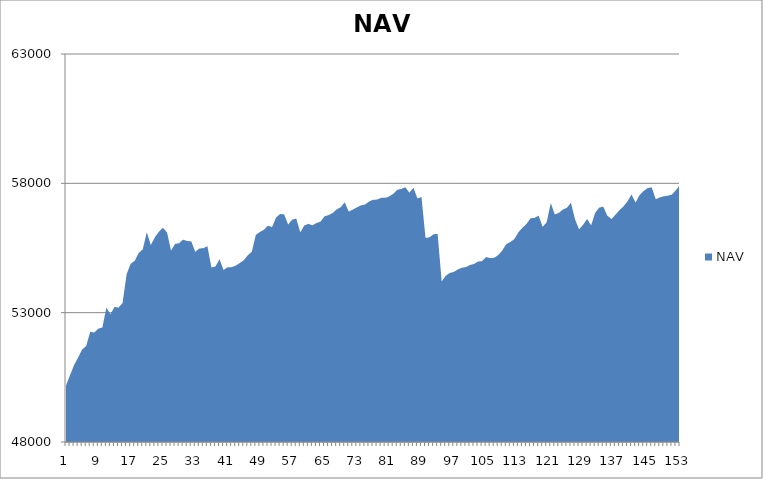
| Category | NAV |
|---|---|
| 0 | 50185.185 |
| 1 | 50585.185 |
| 2 | 50973.977 |
| 3 | 51265.977 |
| 4 | 51576.741 |
| 5 | 51711.523 |
| 6 | 52262.893 |
| 7 | 52230.24 |
| 8 | 52381.556 |
| 9 | 52425.915 |
| 10 | 53192.581 |
| 11 | 52939.146 |
| 12 | 53220.069 |
| 13 | 53197.341 |
| 14 | 53369.61 |
| 15 | 54480.721 |
| 16 | 54888.365 |
| 17 | 55001.902 |
| 18 | 55308.308 |
| 19 | 55448.308 |
| 20 | 56110.305 |
| 21 | 55610.305 |
| 22 | 55916.954 |
| 23 | 56129.798 |
| 24 | 56279.798 |
| 25 | 56105.301 |
| 26 | 55401.645 |
| 27 | 55657.201 |
| 28 | 55686.925 |
| 29 | 55823.001 |
| 30 | 55769.596 |
| 31 | 55759.375 |
| 32 | 55350.284 |
| 33 | 55480.284 |
| 34 | 55492.498 |
| 35 | 55570.42 |
| 36 | 54746.89 |
| 37 | 54783.7 |
| 38 | 55066.459 |
| 39 | 54651.074 |
| 40 | 54754.078 |
| 41 | 54760.213 |
| 42 | 54816.924 |
| 43 | 54917.296 |
| 44 | 55025.73 |
| 45 | 55220.535 |
| 46 | 55353.465 |
| 47 | 56009.309 |
| 48 | 56118.959 |
| 49 | 56205.212 |
| 50 | 56362.876 |
| 51 | 56307.394 |
| 52 | 56678.935 |
| 53 | 56813.264 |
| 54 | 56799.502 |
| 55 | 56409.112 |
| 56 | 56596.44 |
| 57 | 56640.493 |
| 58 | 56102.227 |
| 59 | 56370.449 |
| 60 | 56434.248 |
| 61 | 56376.841 |
| 62 | 56464.524 |
| 63 | 56518.022 |
| 64 | 56724.747 |
| 65 | 56770.361 |
| 66 | 56848.099 |
| 67 | 56992.896 |
| 68 | 57073.571 |
| 69 | 57266.481 |
| 70 | 56908.016 |
| 71 | 56984.939 |
| 72 | 57069.276 |
| 73 | 57147.627 |
| 74 | 57179.83 |
| 75 | 57291.17 |
| 76 | 57366.35 |
| 77 | 57371.599 |
| 78 | 57439.215 |
| 79 | 57440.895 |
| 80 | 57490.895 |
| 81 | 57593.679 |
| 82 | 57746.643 |
| 83 | 57785.413 |
| 84 | 57849.748 |
| 85 | 57639.346 |
| 86 | 57828.82 |
| 87 | 57417.055 |
| 88 | 57471.335 |
| 89 | 55888.376 |
| 90 | 55913.907 |
| 91 | 56031.989 |
| 92 | 56044.711 |
| 93 | 54210.631 |
| 94 | 54422.612 |
| 95 | 54536.647 |
| 96 | 54575.903 |
| 97 | 54670.229 |
| 98 | 54737.367 |
| 99 | 54762.386 |
| 100 | 54842.923 |
| 101 | 54881.385 |
| 102 | 54978.816 |
| 103 | 54991.283 |
| 104 | 55149.699 |
| 105 | 55109.498 |
| 106 | 55121.656 |
| 107 | 55227.569 |
| 108 | 55405.15 |
| 109 | 55650.183 |
| 110 | 55733.424 |
| 111 | 55846.244 |
| 112 | 56110.95 |
| 113 | 56283.172 |
| 114 | 56430.541 |
| 115 | 56648.489 |
| 116 | 56663.919 |
| 117 | 56752.272 |
| 118 | 56318.108 |
| 119 | 56496.442 |
| 120 | 57240.145 |
| 121 | 56797.081 |
| 122 | 56857.303 |
| 123 | 56985.874 |
| 124 | 57053.805 |
| 125 | 57249.117 |
| 126 | 56612.311 |
| 127 | 56221.507 |
| 128 | 56394.346 |
| 129 | 56622.008 |
| 130 | 56375.255 |
| 131 | 56862.384 |
| 132 | 57060.137 |
| 133 | 57099.524 |
| 134 | 56750.37 |
| 135 | 56622.71 |
| 136 | 56780.605 |
| 137 | 56961.84 |
| 138 | 57105.4 |
| 139 | 57301.96 |
| 140 | 57570.545 |
| 141 | 57256.886 |
| 142 | 57545.679 |
| 143 | 57705.679 |
| 144 | 57817.679 |
| 145 | 57845.512 |
| 146 | 57383.973 |
| 147 | 57457.609 |
| 148 | 57498.333 |
| 149 | 57523.57 |
| 150 | 57565.004 |
| 151 | 57735.592 |
| 152 | 57941.474 |